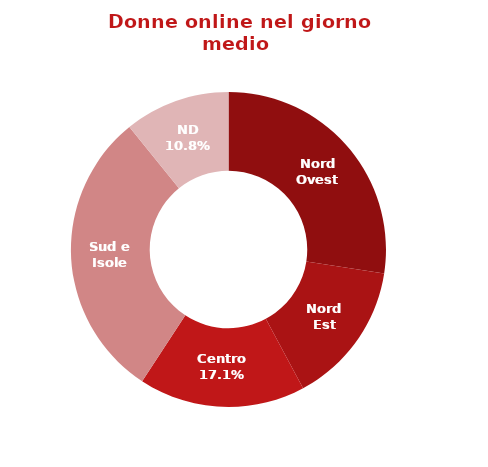
| Category | Series 0 |
|---|---|
| Nord Ovest | 0.274 |
| Nord Est | 0.147 |
| Centro | 0.171 |
| Sud e Isole | 0.299 |
| ND | 0.108 |